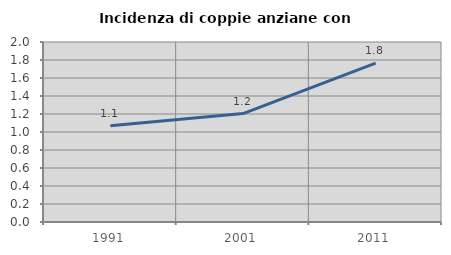
| Category | Incidenza di coppie anziane con figli |
|---|---|
| 1991.0 | 1.07 |
| 2001.0 | 1.205 |
| 2011.0 | 1.765 |